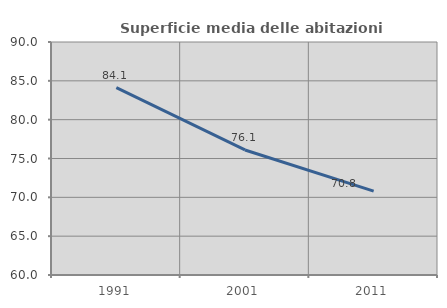
| Category | Superficie media delle abitazioni occupate |
|---|---|
| 1991.0 | 84.124 |
| 2001.0 | 76.098 |
| 2011.0 | 70.795 |